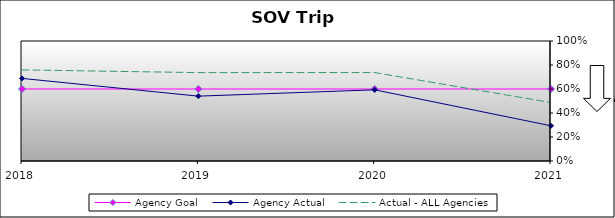
| Category | Agency Goal | Agency Actual | Actual - ALL Agencies |
|---|---|---|---|
| 2018.0 | 0.6 | 0.688 | 0.759 |
| 2019.0 | 0.6 | 0.54 | 0.736 |
| 2020.0 | 0.6 | 0.593 | 0.737 |
| 2021.0 | 0.6 | 0.293 | 0.487 |